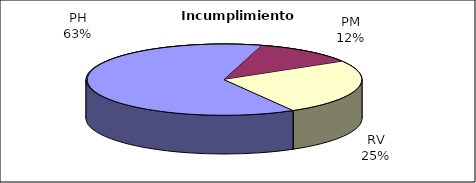
| Category | Valores |
|---|---|
| PH | 177 |
| PM | 34 |
| RV | 71 |